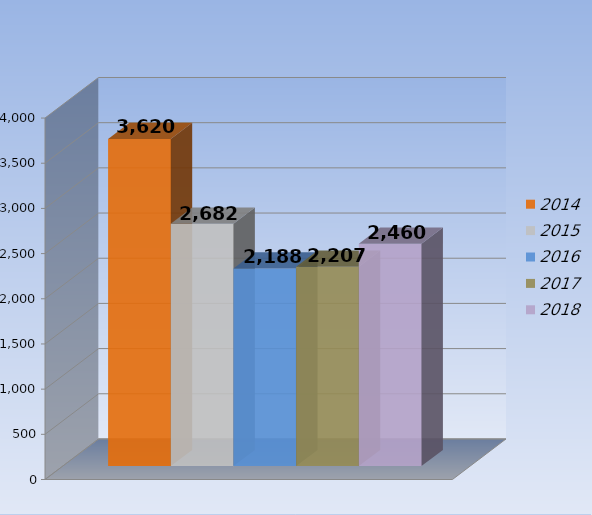
| Category | 2014 | 2015 | 2016 | 2017 | 2018 |
|---|---|---|---|---|---|
| 0 | 3620 | 2682 | 2188 | 2207 | 2460 |